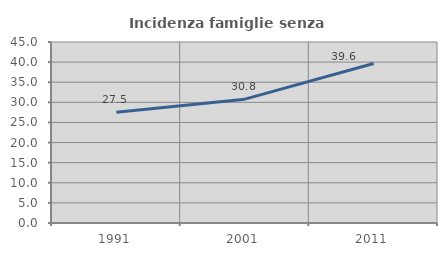
| Category | Incidenza famiglie senza nuclei |
|---|---|
| 1991.0 | 27.546 |
| 2001.0 | 30.785 |
| 2011.0 | 39.638 |